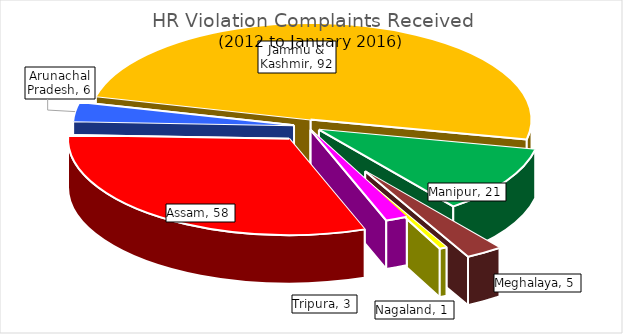
| Category | Complaints received |
|---|---|
| Assam | 58 |
| Arunachal Pradesh | 6 |
| Jammu & Kashmir | 92 |
| Manipur | 21 |
| Meghalaya | 5 |
| Nagaland | 1 |
| Tripura | 3 |